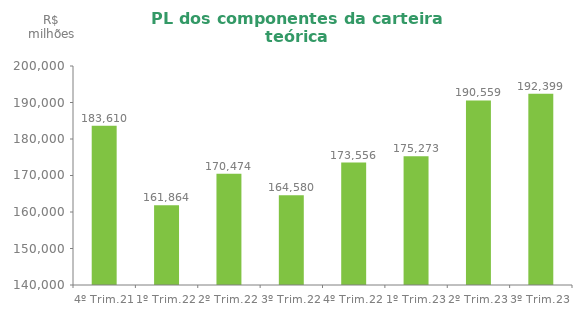
| Category | Series 0 |
|---|---|
| 4º Trim.21 | 183610.486 |
| 1º Trim.22 | 161864.31 |
| 2º Trim.22 | 170474.192 |
| 3º Trim.22 | 164580 |
| 4º Trim.22 | 173556 |
| 1º Trim.23 | 175273 |
| 2º Trim.23 | 190559 |
| 3º Trim.23 | 192399 |